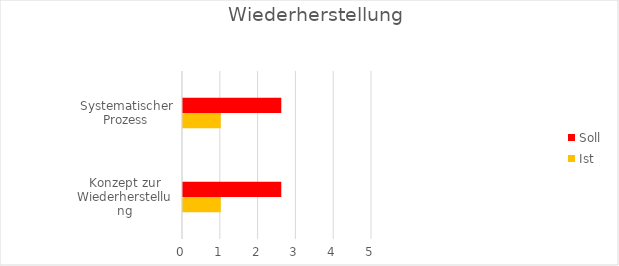
| Category | Ist | Soll |
|---|---|---|
| Konzept zur Wiederherstellung | 1 | 2.6 |
| Systematischer Prozess | 1 | 2.6 |